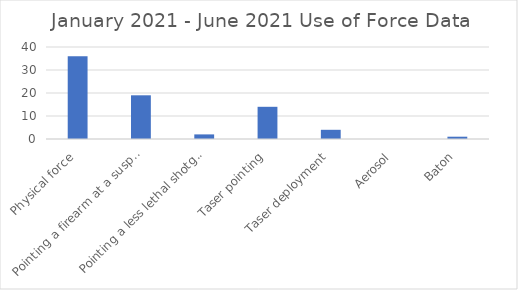
| Category | Series 0 |
|---|---|
| Physical force | 36 |
| Pointing a firearm at a suspect | 19 |
| Pointing a less lethal shotgun | 2 |
| Taser pointing | 14 |
| Taser deployment | 4 |
| Aerosol | 0 |
| Baton | 1 |